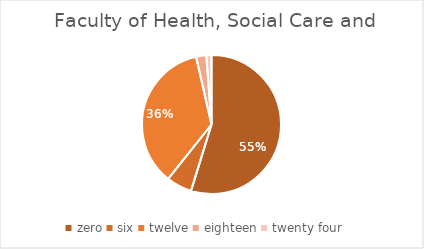
| Category | Series 0 |
|---|---|
| zero | 46 |
| six | 5 |
| twelve | 30 |
| eighteen | 2 |
| twenty four | 1 |